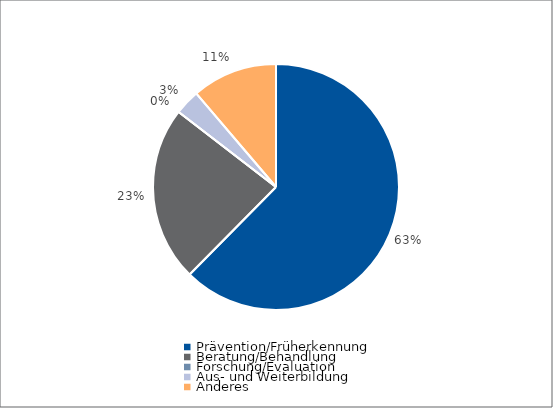
| Category | Series 0 |
|---|---|
| Prävention/Früherkennung | 66620 |
| Beratung/Behandlung | 24613 |
| Forschung/Evaluation | 0 |
| Aus- und Weiterbildung | 3538 |
| Anderes | 12000 |